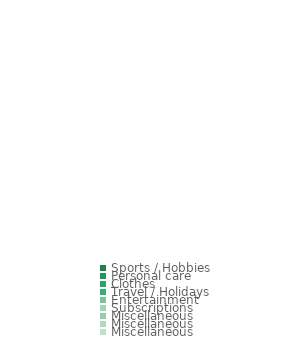
| Category | Series 0 |
|---|---|
| Sports / Hobbies | 0 |
| Personal care | 0 |
| Clothes  | 0 |
| Travel / Holidays | 0 |
| Entertainment | 0 |
| Subscriptions | 0 |
| Miscellaneous | 0 |
| Miscellaneous | 0 |
| Miscellaneous | 0 |